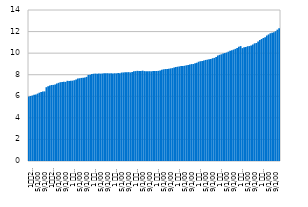
| Category | Девизна штедња становништва |
|---|---|
| 1
2010. | 5.977 |
| 2 | 6.029 |
| 3 | 6.072 |
| 4 | 6.135 |
| 5 | 6.163 |
| 6 | 6.249 |
| 7 | 6.334 |
| 8 | 6.407 |
| 9 | 6.432 |
| 10 | 6.452 |
| 11 | 6.843 |
| 12 | 6.939 |
| 1
2011. | 7.004 |
| 2 | 7.045 |
| 3 | 7.055 |
| 4 | 7.099 |
| 5 | 7.189 |
| 6 | 7.247 |
| 7 | 7.304 |
| 8 | 7.331 |
| 9 | 7.355 |
| 10 | 7.334 |
| 11 | 7.435 |
| 12 | 7.412 |
| 1 
2012. | 7.43 |
| 2 | 7.449 |
| 3 | 7.491 |
| 4 | 7.555 |
| 5 | 7.638 |
| 6 | 7.67 |
| 7 | 7.704 |
| 8 | 7.713 |
| 9 | 7.744 |
| 10 | 7.801 |
| 11 | 7.984 |
| 12 | 8.001 |
| 1 
2013. | 8.056 |
| 2 | 8.09 |
| 3 | 8.104 |
| 4 | 8.089 |
| 5 | 8.109 |
| 6 | 8.099 |
| 7 | 8.113 |
| 8 | 8.145 |
| 9 | 8.143 |
| 10 | 8.139 |
| 11 | 8.125 |
| 12 | 8.146 |
| 1 
2014. | 8.105 |
| 2 | 8.136 |
| 3 | 8.128 |
| 4 | 8.153 |
| 5 | 8.145 |
| 6 | 8.2 |
| 7 | 8.209 |
| 8 | 8.218 |
| 9 | 8.219 |
| 10 | 8.24 |
| 11 | 8.212 |
| 12 | 8.253 |
| 1 
2015. | 8.329 |
| 2 | 8.334 |
| 3 | 8.36 |
| 4 | 8.349 |
| 5 | 8.345 |
| 6 | 8.376 |
| 7 | 8.335 |
| 8 | 8.321 |
| 9 | 8.31 |
| 10 | 8.326 |
| 11 | 8.314 |
| 12 | 8.339 |
| 1 
2016. | 8.335 |
| 2 | 8.347 |
| 3 | 8.358 |
| 4 | 8.384 |
| 5 | 8.466 |
| 6 | 8.5 |
| 7 | 8.525 |
| 8 | 8.535 |
| 9 | 8.547 |
| 10 | 8.587 |
| 11 | 8.613 |
| 12 | 8.674 |
| 1 
2017. | 8.718 |
| 2 | 8.742 |
| 3 | 8.769 |
| 4 | 8.802 |
| 5 | 8.798 |
| 6 | 8.83 |
| 7 | 8.873 |
| 8 | 8.911 |
| 9 | 8.956 |
| 10 | 8.985 |
| 11 | 8.994 |
| 12 | 9.069 |
| 1 
2018. | 9.105 |
| 2 | 9.203 |
| 3 | 9.25 |
| 4 | 9.276 |
| 5 | 9.319 |
| 6 | 9.37 |
| 7 | 9.397 |
| 8 | 9.445 |
| 9 | 9.465 |
| 10 | 9.528 |
| 11 | 9.561 |
| 12 | 9.643 |
| 1 
2019. | 9.793 |
| 2 | 9.843 |
| 3 | 9.894 |
| 4 | 9.965 |
| 5 | 10.015 |
| 6 | 10.059 |
| 7 | 10.136 |
| 8 | 10.215 |
| 9 | 10.27 |
| 10 | 10.329 |
| 11 | 10.396 |
| 12 | 10.473 |
| 1 
2020. | 10.599 |
| 2 | 10.654 |
| 3 | 10.467 |
| 4 | 10.536 |
| 5 | 10.563 |
| 6 | 10.64 |
| 7 | 10.656 |
| 8 | 10.719 |
| 9 | 10.808 |
| 10 | 10.909 |
| 11 | 10.943 |
| 12 | 11.07 |
| 1 
2021. | 11.216 |
| 2 | 11.312 |
| 3 | 11.407 |
| 4 | 11.471 |
| 5 | 11.627 |
| 6 | 11.737 |
| 7 | 11.843 |
| 8 | 11.897 |
| 9 | 11.939 |
| 10 | 12.034 |
| 11 | 12.178 |
| 12 | 12.316 |